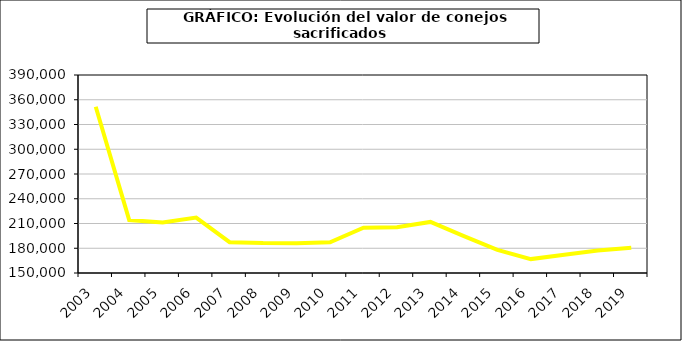
| Category | Peso canal |
|---|---|
| 2003.0 | 351465.713 |
| 2004.0 | 214260.585 |
| 2005.0 | 211365.141 |
| 2006.0 | 217184.462 |
| 2007.0 | 187399.808 |
| 2008.0 | 186307.329 |
| 2009.0 | 186191.465 |
| 2010.0 | 187154.598 |
| 2011.0 | 204859.313 |
| 2012.0 | 205502.84 |
| 2013.0 | 211908.742 |
| 2014.0 | 194679.563 |
| 2015.0 | 178061.247 |
| 2016.0 | 166839.861 |
| 2017.0 | 172070.125 |
| 2018.0 | 177201.6 |
| 2019.0 | 180468.576 |